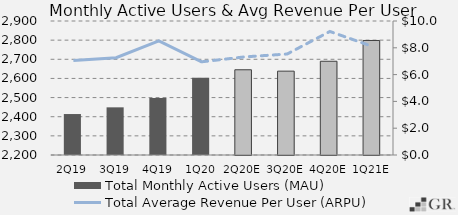
| Category | Total Monthly Active Users (MAU)  |
|---|---|
|  2Q19  | 2414 |
|  3Q19  | 2449 |
|  4Q19  | 2497.8 |
|  1Q20  | 2603 |
|  2Q20E  | 2645.202 |
|  3Q20E  | 2638.057 |
|  4Q20E  | 2689.735 |
|  1Q21E  | 2798.219 |